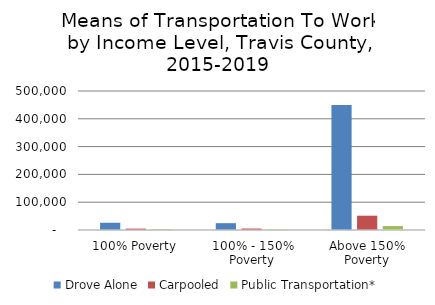
| Category | Drove Alone | Carpooled | Public Transportation* |
|---|---|---|---|
| 100% Poverty | 26021.476 | 4926.24 | 3361.39 |
| 100% - 150% Poverty | 24520.237 | 5234.13 | 1943 |
| Above 150% Poverty | 449871.287 | 51417.63 | 14125.61 |